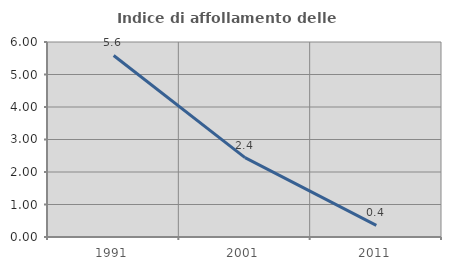
| Category | Indice di affollamento delle abitazioni  |
|---|---|
| 1991.0 | 5.586 |
| 2001.0 | 2.442 |
| 2011.0 | 0.357 |